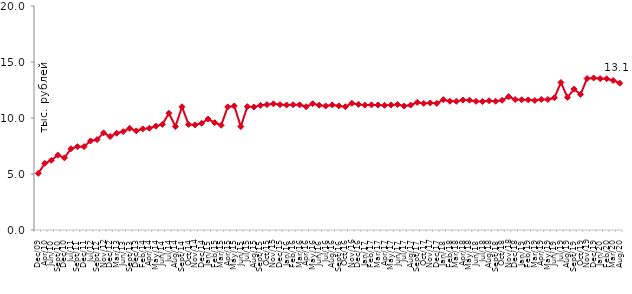
| Category | медианное значение среднедушевого располагаемого дохода, тыс. руб. |
|---|---|
| 2009-12-01 | 5.058 |
| 2010-04-01 | 5.949 |
| 2010-06-01 | 6.224 |
| 2010-09-01 | 6.686 |
| 2010-12-01 | 6.44 |
| 2011-07-01 | 7.25 |
| 2011-09-01 | 7.441 |
| 2011-12-01 | 7.446 |
| 2012-07-01 | 7.95 |
| 2012-09-01 | 8.071 |
| 2012-11-01 | 8.673 |
| 2012-12-01 | 8.345 |
| 2013-03-01 | 8.644 |
| 2013-06-01 | 8.789 |
| 2013-09-01 | 9.079 |
| 2013-12-01 | 8.849 |
| 2014-02-01 | 9.025 |
| 2014-04-01 | 9.087 |
| 2014-05-01 | 9.273 |
| 2014-06-01 | 9.432 |
| 2014-07-01 | 10.422 |
| 2014-08-01 | 9.241 |
| 2014-09-01 | 11 |
| 2014-10-01 | 9.426 |
| 2014-11-01 | 9.381 |
| 2014-12-01 | 9.532 |
| 2015-01-01 | 9.908 |
| 2015-02-01 | 9.585 |
| 2015-03-01 | 9.35 |
| 2015-04-01 | 10.991 |
| 2015-05-01 | 11.076 |
| 2015-06-01 | 9.237 |
| 2015-07-01 | 11.013 |
| 2015-08-01 | 10.981 |
| 2015-09-01 | 11.124 |
| 2015-10-01 | 11.195 |
| 2015-11-01 | 11.268 |
| 2015-12-01 | 11.194 |
| 2016-01-01 | 11.158 |
| 2016-02-01 | 11.188 |
| 2016-03-01 | 11.174 |
| 2016-04-01 | 11.01 |
| 2016-05-01 | 11.278 |
| 2016-06-01 | 11.142 |
| 2016-07-01 | 11.072 |
| 2016-08-01 | 11.165 |
| 2016-09-01 | 11.082 |
| 2016-10-01 | 11.008 |
| 2016-11-01 | 11.313 |
| 2016-12-01 | 11.216 |
| 2017-01-01 | 11.146 |
| 2017-02-01 | 11.17 |
| 2017-03-01 | 11.162 |
| 2017-04-01 | 11.133 |
| 2017-05-01 | 11.163 |
| 2017-06-01 | 11.207 |
| 2017-07-01 | 11.066 |
| 2017-08-01 | 11.153 |
| 2017-09-01 | 11.395 |
| 2017-10-01 | 11.301 |
| 2017-11-01 | 11.342 |
| 2017-12-01 | 11.31 |
| 2018-01-01 | 11.637 |
| 2018-02-01 | 11.497 |
| 2018-03-01 | 11.49 |
| 2018-04-01 | 11.601 |
| 2018-05-01 | 11.592 |
| 2018-06-01 | 11.491 |
| 2018-07-01 | 11.471 |
| 2018-08-01 | 11.541 |
| 2018-09-01 | 11.497 |
| 2018-10-01 | 11.578 |
| 2018-11-01 | 11.906 |
| 2018-12-01 | 11.648 |
| 2019-01-01 | 11.629 |
| 2019-02-01 | 11.617 |
| 2019-03-01 | 11.566 |
| 2019-04-01 | 11.659 |
| 2019-05-01 | 11.653 |
| 2019-06-01 | 11.805 |
| 2019-07-01 | 13.174 |
| 2019-08-01 | 11.844 |
| 2019-09-01 | 12.577 |
| 2019-10-01 | 12.107 |
| 2019-11-01 | 13.523 |
| 2019-12-01 | 13.573 |
| 2020-01-01 | 13.516 |
| 2020-02-01 | 13.502 |
| 2020-03-01 | 13.349 |
| 2020-08-01 | 13.113 |